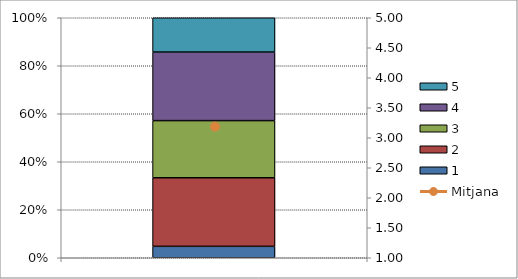
| Category | 1 | 2 | 3 | 4 | 5 |
|---|---|---|---|---|---|
|  | 1 | 6 | 5 | 6 | 3 |